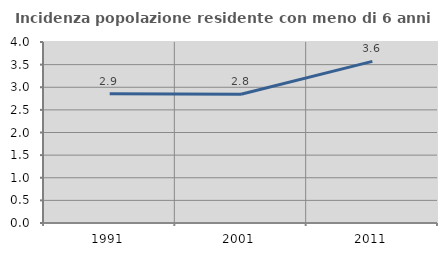
| Category | Incidenza popolazione residente con meno di 6 anni |
|---|---|
| 1991.0 | 2.857 |
| 2001.0 | 2.847 |
| 2011.0 | 3.571 |